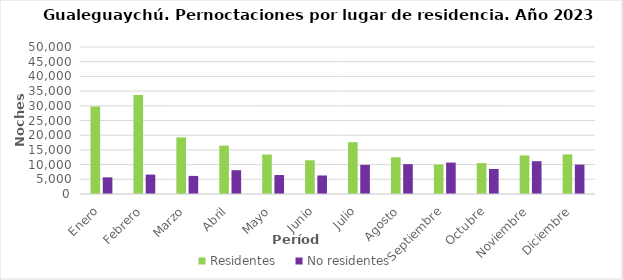
| Category | Residentes | No residentes |
|---|---|---|
| Enero | 29795 | 5661 |
| Febrero | 33631 | 6600 |
| Marzo | 19246 | 6157 |
| Abril | 16436 | 8090 |
| Mayo | 13431 | 6451 |
| Junio | 11467 | 6303 |
| Julio | 17622 | 9911 |
| Agosto | 12489 | 10154 |
| Septiembre | 10008 | 10690 |
| Octubre | 10514 | 8505 |
| Noviembre | 13108 | 11155 |
| Diciembre | 13466 | 9994 |